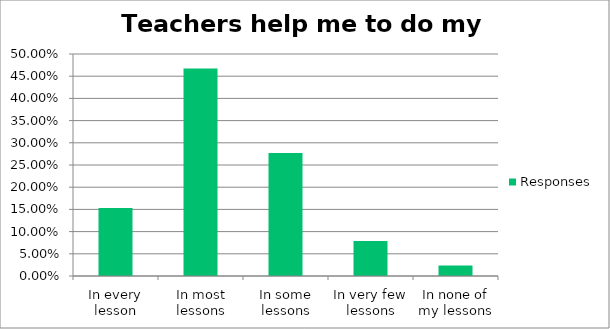
| Category | Responses |
|---|---|
| In every lesson | 0.153 |
| In most lessons | 0.468 |
| In some lessons | 0.277 |
| In very few lessons | 0.079 |
| In none of my lessons | 0.023 |